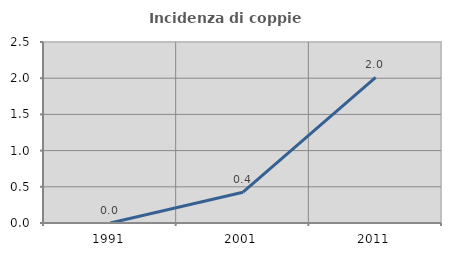
| Category | Incidenza di coppie miste |
|---|---|
| 1991.0 | 0 |
| 2001.0 | 0.426 |
| 2011.0 | 2.01 |